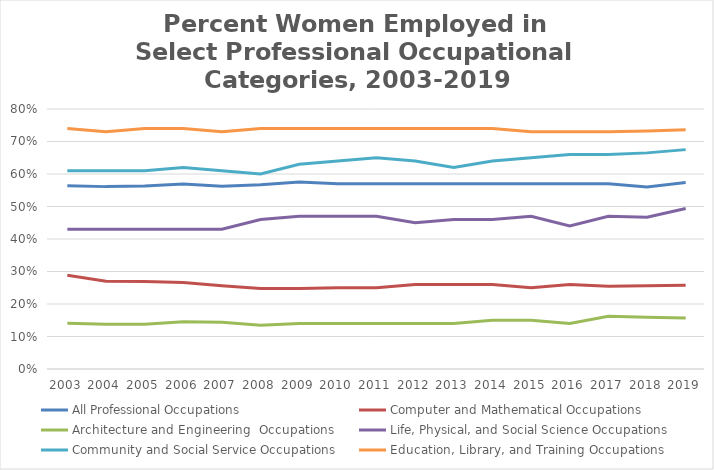
| Category | All Professional Occupations | Computer and Mathematical Occupations | Architecture and Engineering  Occupations | Life, Physical, and Social Science Occupations | Community and Social Service Occupations | Education, Library, and Training Occupations |
|---|---|---|---|---|---|---|
| 2003 | 0.564 | 0.288 | 0.141 | 0.43 | 0.61 | 0.74 |
| 2004 | 0.561 | 0.27 | 0.138 | 0.43 | 0.61 | 0.73 |
| 2005 | 0.563 | 0.27 | 0.138 | 0.43 | 0.61 | 0.74 |
| 2006 | 0.569 | 0.266 | 0.146 | 0.43 | 0.62 | 0.74 |
| 2007 | 0.562 | 0.256 | 0.144 | 0.43 | 0.61 | 0.73 |
| 2008 | 0.567 | 0.248 | 0.135 | 0.46 | 0.6 | 0.74 |
| 2009 | 0.575 | 0.248 | 0.14 | 0.47 | 0.63 | 0.74 |
| 2010 | 0.57 | 0.25 | 0.14 | 0.47 | 0.64 | 0.74 |
| 2011 | 0.57 | 0.25 | 0.14 | 0.47 | 0.65 | 0.74 |
| 2012 | 0.57 | 0.26 | 0.14 | 0.45 | 0.64 | 0.74 |
| 2013 | 0.57 | 0.26 | 0.14 | 0.46 | 0.62 | 0.74 |
| 2014 | 0.57 | 0.26 | 0.15 | 0.46 | 0.64 | 0.74 |
| 2015 | 0.57 | 0.25 | 0.15 | 0.47 | 0.65 | 0.73 |
| 2016 | 0.57 | 0.26 | 0.14 | 0.44 | 0.66 | 0.73 |
| 2017 | 0.57 | 0.255 | 0.162 | 0.47 | 0.66 | 0.73 |
| 2018 | 0.56 | 0.256 | 0.159 | 0.467 | 0.665 | 0.732 |
| 2019 | 0.574 | 0.258 | 0.157 | 0.494 | 0.675 | 0.736 |